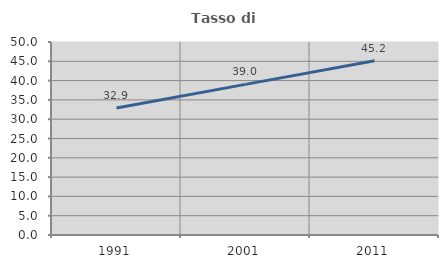
| Category | Tasso di occupazione   |
|---|---|
| 1991.0 | 32.877 |
| 2001.0 | 39.024 |
| 2011.0 | 45.161 |